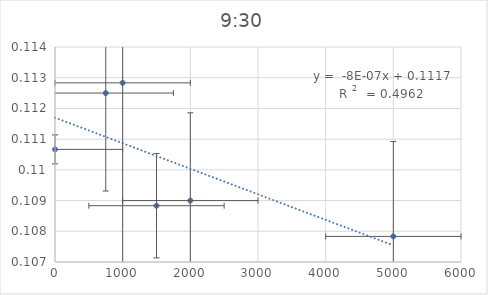
| Category | Series 0 |
|---|---|
| 5000.0 | 0.108 |
| 2000.0 | 0.109 |
| 1500.0 | 0.109 |
| 1000.0 | 0.113 |
| 750.0 | 0.112 |
| 0.0 | 0.111 |